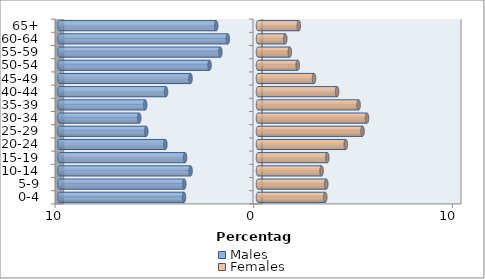
| Category | Males | Females |
|---|---|---|
| 0-4 | -3.724 | 3.385 |
| 5-9 | -3.712 | 3.437 |
| 10-14 | -3.394 | 3.2 |
| 15-19 | -3.671 | 3.489 |
| 20-24 | -4.663 | 4.418 |
| 25-29 | -5.624 | 5.263 |
| 30-34 | -5.978 | 5.488 |
| 35-39 | -5.677 | 5.066 |
| 40-44 | -4.628 | 3.982 |
| 45-49 | -3.397 | 2.821 |
| 50-54 | -2.438 | 2 |
| 55-59 | -1.893 | 1.6 |
| 60-64 | -1.518 | 1.373 |
| 65+ | -2.103 | 2.057 |